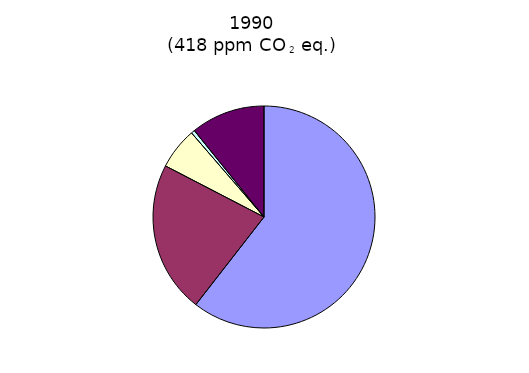
| Category | 1990 |
|---|---|
| CO2 | 1.289 |
| CH4 | 0.47 |
| N2O | 0.129 |
| PFC,HFC,SF6 | 0.011 |
| Montreal gasses | 0.23 |